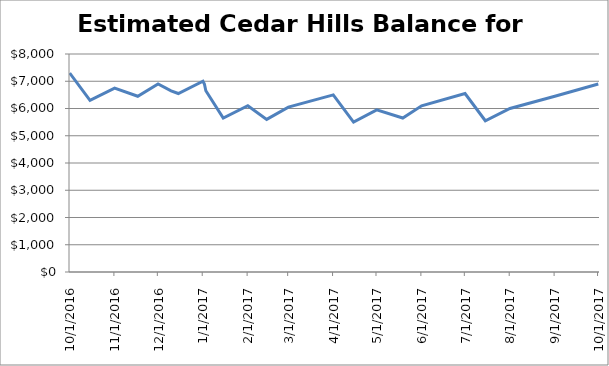
| Category | Cedar Hills balance |
|---|---|
| 10/1/16 | 7300 |
| 10/15/16 | 6300 |
| 11/1/16 | 6750 |
| 11/17/16 | 6450 |
| 12/1/16 | 6900 |
| 12/10/16 | 6650 |
| 12/15/16 | 6550 |
| 1/1/17 | 7000 |
| 1/2/17 | 6900 |
| 1/3/17 | 6650 |
| 1/15/17 | 5650 |
| 2/1/17 | 6100 |
| 2/14/17 | 5600 |
| 3/1/17 | 6050 |
| 4/1/17 | 6500 |
| 4/15/17 | 5500 |
| 5/1/17 | 5950 |
| 5/19/17 | 5650 |
| 6/1/17 | 6100 |
| 7/1/17 | 6550 |
| 7/15/17 | 5550 |
| 8/1/17 | 6000 |
| 9/1/17 | 6450 |
| 10/1/17 | 6900 |